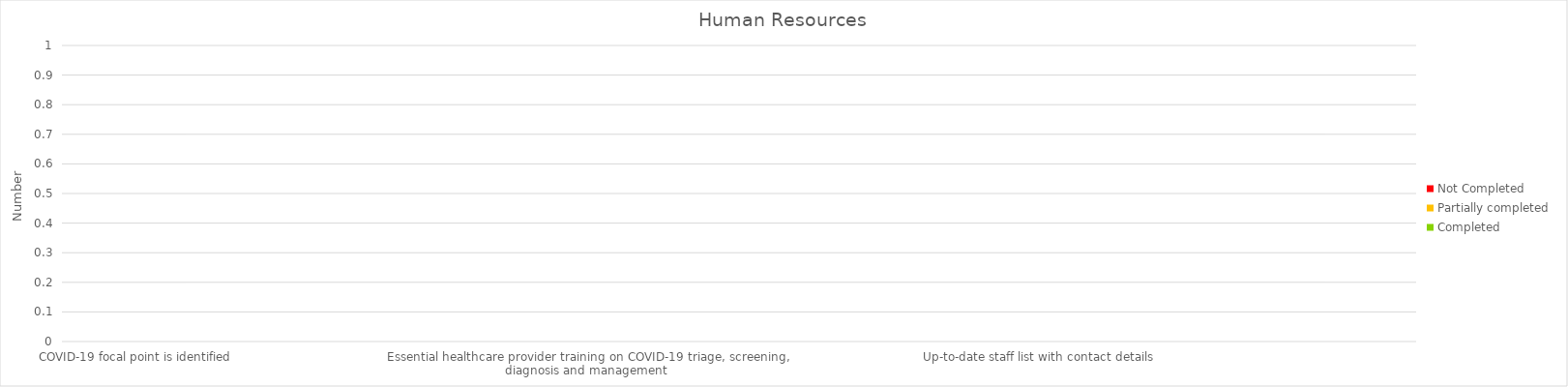
| Category | Completed | Partially completed | Not Completed |
|---|---|---|---|
| COVID-19 focal point is identified | 0 | 0 | 0 |
| Roles and responsibilities for the COVID-19 response team are assigned | 0 | 0 | 0 |
| Every staff member has received information about the COVID-19 virus, pandemic and the response and their role  | 0 | 0 | 0 |
| Essential healthcare provider training on COVID-19 triage, screening, diagnosis and management  | 0 | 0 | 0 |
| Laboratory staff are trained in safe handling of samples for transfer to reference laboratory  | 0 | 0 | 0 |
| Rota / plan to ensure there are designated staff for COVID-19 and non-COVID-19 patients  | 0 | 0 | 0 |
| Up-to-date staff list with contact details | 0 | 0 | 0 |
| Daily staff presence list (to facilitate future contact tracing) | 0 | 0 | 0 |
| Protocol is in place to diagnose, isolate, manage and follow-up exposed staff and trace contacts | 0 | 0 | 0 |